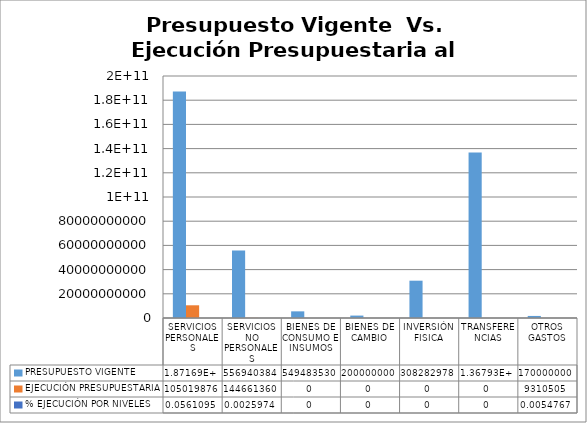
| Category | PRESUPUESTO VIGENTE | EJECUCIÓN PRESUPUESTARIA | % EJECUCIÓN POR NIVELES |
|---|---|---|---|
| SERVICIOS PERSONALES | 187169451235 | 10501987615 | 0.056 |
| SERVICIOS NO PERSONALES | 55694038462 | 144661360 | 0.003 |
| BIENES DE CONSUMO E INSUMOS | 5494835306 | 0 | 0 |
| BIENES DE CAMBIO | 2000000000 | 0 | 0 |
| INVERSIÓN FISICA | 30828297854 | 0 | 0 |
| TRANSFERENCIAS | 136793493119 | 0 | 0 |
| OTROS GASTOS | 1700000000 | 9310505 | 0.005 |